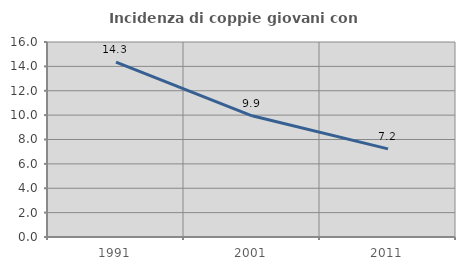
| Category | Incidenza di coppie giovani con figli |
|---|---|
| 1991.0 | 14.34 |
| 2001.0 | 9.944 |
| 2011.0 | 7.229 |